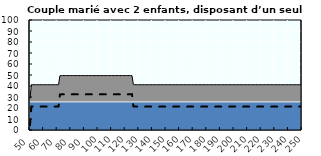
| Category | Coin fiscal marginal (somme des composantes) | Taux d’imposition marginal net |
|---|---|---|
| 50.0 | 28.469 | 4.291 |
| 51.0 | 41.166 | 21.28 |
| 52.0 | 41.166 | 21.28 |
| 53.0 | 41.166 | 21.28 |
| 54.0 | 41.166 | 21.28 |
| 55.0 | 41.166 | 21.28 |
| 56.0 | 41.166 | 21.28 |
| 57.0 | 41.166 | 21.28 |
| 58.0 | 41.166 | 21.28 |
| 59.0 | 41.166 | 21.28 |
| 60.0 | 41.166 | 21.28 |
| 61.0 | 41.166 | 21.28 |
| 62.0 | 41.166 | 21.28 |
| 63.0 | 41.166 | 21.28 |
| 64.0 | 41.166 | 21.28 |
| 65.0 | 41.166 | 21.28 |
| 66.0 | 41.166 | 21.28 |
| 67.0 | 41.166 | 21.28 |
| 68.0 | 41.166 | 21.28 |
| 69.0 | 41.166 | 21.28 |
| 70.0 | 41.166 | 21.28 |
| 71.0 | 41.166 | 21.28 |
| 72.0 | 49.358 | 32.24 |
| 73.0 | 49.47 | 32.391 |
| 74.0 | 49.47 | 32.391 |
| 75.0 | 49.47 | 32.391 |
| 76.0 | 49.47 | 32.391 |
| 77.0 | 49.47 | 32.391 |
| 78.0 | 49.47 | 32.391 |
| 79.0 | 49.47 | 32.391 |
| 80.0 | 49.47 | 32.391 |
| 81.0 | 49.47 | 32.391 |
| 82.0 | 49.47 | 32.391 |
| 83.0 | 49.47 | 32.391 |
| 84.0 | 49.47 | 32.391 |
| 85.0 | 49.47 | 32.391 |
| 86.0 | 49.47 | 32.391 |
| 87.0 | 49.47 | 32.391 |
| 88.0 | 49.47 | 32.391 |
| 89.0 | 49.47 | 32.391 |
| 90.0 | 49.47 | 32.391 |
| 91.0 | 49.47 | 32.391 |
| 92.0 | 49.47 | 32.391 |
| 93.0 | 49.47 | 32.391 |
| 94.0 | 49.47 | 32.391 |
| 95.0 | 49.47 | 32.391 |
| 96.0 | 49.47 | 32.391 |
| 97.0 | 49.47 | 32.391 |
| 98.0 | 49.47 | 32.391 |
| 99.0 | 49.47 | 32.391 |
| 100.0 | 49.47 | 32.391 |
| 101.0 | 49.47 | 32.391 |
| 102.0 | 49.47 | 32.391 |
| 103.0 | 49.47 | 32.391 |
| 104.0 | 49.47 | 32.391 |
| 105.0 | 49.47 | 32.391 |
| 106.0 | 49.47 | 32.391 |
| 107.0 | 49.47 | 32.391 |
| 108.0 | 49.47 | 32.391 |
| 109.0 | 49.47 | 32.391 |
| 110.0 | 49.47 | 32.391 |
| 111.0 | 49.47 | 32.391 |
| 112.0 | 49.47 | 32.391 |
| 113.0 | 49.47 | 32.391 |
| 114.0 | 49.47 | 32.391 |
| 115.0 | 49.47 | 32.391 |
| 116.0 | 49.47 | 32.391 |
| 117.0 | 49.47 | 32.391 |
| 118.0 | 49.47 | 32.391 |
| 119.0 | 49.47 | 32.391 |
| 120.0 | 49.47 | 32.391 |
| 121.0 | 49.47 | 32.391 |
| 122.0 | 49.47 | 32.391 |
| 123.0 | 49.47 | 32.391 |
| 124.0 | 49.47 | 32.391 |
| 125.0 | 49.47 | 32.391 |
| 126.0 | 41.363 | 21.544 |
| 127.0 | 41.166 | 21.28 |
| 128.0 | 41.166 | 21.28 |
| 129.0 | 41.166 | 21.28 |
| 130.0 | 41.166 | 21.28 |
| 131.0 | 41.166 | 21.28 |
| 132.0 | 41.166 | 21.28 |
| 133.0 | 41.166 | 21.28 |
| 134.0 | 41.166 | 21.28 |
| 135.0 | 41.166 | 21.28 |
| 136.0 | 41.166 | 21.28 |
| 137.0 | 41.166 | 21.28 |
| 138.0 | 41.166 | 21.28 |
| 139.0 | 41.166 | 21.28 |
| 140.0 | 41.166 | 21.28 |
| 141.0 | 41.166 | 21.28 |
| 142.0 | 41.166 | 21.28 |
| 143.0 | 41.166 | 21.28 |
| 144.0 | 41.166 | 21.28 |
| 145.0 | 41.166 | 21.28 |
| 146.0 | 41.166 | 21.28 |
| 147.0 | 41.166 | 21.28 |
| 148.0 | 41.166 | 21.28 |
| 149.0 | 41.166 | 21.28 |
| 150.0 | 41.166 | 21.28 |
| 151.0 | 41.166 | 21.28 |
| 152.0 | 41.166 | 21.28 |
| 153.0 | 41.166 | 21.28 |
| 154.0 | 41.166 | 21.28 |
| 155.0 | 41.166 | 21.28 |
| 156.0 | 41.166 | 21.28 |
| 157.0 | 41.166 | 21.28 |
| 158.0 | 41.166 | 21.28 |
| 159.0 | 41.166 | 21.28 |
| 160.0 | 41.166 | 21.28 |
| 161.0 | 41.166 | 21.28 |
| 162.0 | 41.166 | 21.28 |
| 163.0 | 41.166 | 21.28 |
| 164.0 | 41.166 | 21.28 |
| 165.0 | 41.166 | 21.28 |
| 166.0 | 41.166 | 21.28 |
| 167.0 | 41.166 | 21.28 |
| 168.0 | 41.166 | 21.28 |
| 169.0 | 41.166 | 21.28 |
| 170.0 | 41.166 | 21.28 |
| 171.0 | 41.166 | 21.28 |
| 172.0 | 41.166 | 21.28 |
| 173.0 | 41.166 | 21.28 |
| 174.0 | 41.166 | 21.28 |
| 175.0 | 41.166 | 21.28 |
| 176.0 | 41.166 | 21.28 |
| 177.0 | 41.166 | 21.28 |
| 178.0 | 41.166 | 21.28 |
| 179.0 | 41.166 | 21.28 |
| 180.0 | 41.166 | 21.28 |
| 181.0 | 41.166 | 21.28 |
| 182.0 | 41.166 | 21.28 |
| 183.0 | 41.166 | 21.28 |
| 184.0 | 41.166 | 21.28 |
| 185.0 | 41.166 | 21.28 |
| 186.0 | 41.166 | 21.28 |
| 187.0 | 41.166 | 21.28 |
| 188.0 | 41.166 | 21.28 |
| 189.0 | 41.166 | 21.28 |
| 190.0 | 41.166 | 21.28 |
| 191.0 | 41.166 | 21.28 |
| 192.0 | 41.166 | 21.28 |
| 193.0 | 41.166 | 21.28 |
| 194.0 | 41.166 | 21.28 |
| 195.0 | 41.166 | 21.28 |
| 196.0 | 41.166 | 21.28 |
| 197.0 | 41.166 | 21.28 |
| 198.0 | 41.166 | 21.28 |
| 199.0 | 41.166 | 21.28 |
| 200.0 | 41.166 | 21.28 |
| 201.0 | 41.166 | 21.28 |
| 202.0 | 41.166 | 21.28 |
| 203.0 | 41.166 | 21.28 |
| 204.0 | 41.166 | 21.28 |
| 205.0 | 41.166 | 21.28 |
| 206.0 | 41.166 | 21.28 |
| 207.0 | 41.166 | 21.28 |
| 208.0 | 41.166 | 21.28 |
| 209.0 | 41.166 | 21.28 |
| 210.0 | 41.166 | 21.28 |
| 211.0 | 41.166 | 21.28 |
| 212.0 | 41.166 | 21.28 |
| 213.0 | 41.166 | 21.28 |
| 214.0 | 41.166 | 21.28 |
| 215.0 | 41.166 | 21.28 |
| 216.0 | 41.166 | 21.28 |
| 217.0 | 41.166 | 21.28 |
| 218.0 | 41.166 | 21.28 |
| 219.0 | 41.166 | 21.28 |
| 220.0 | 41.166 | 21.28 |
| 221.0 | 41.166 | 21.28 |
| 222.0 | 41.166 | 21.28 |
| 223.0 | 41.166 | 21.28 |
| 224.0 | 41.166 | 21.28 |
| 225.0 | 41.166 | 21.28 |
| 226.0 | 41.166 | 21.28 |
| 227.0 | 41.166 | 21.28 |
| 228.0 | 41.166 | 21.28 |
| 229.0 | 41.166 | 21.28 |
| 230.0 | 41.166 | 21.28 |
| 231.0 | 41.166 | 21.28 |
| 232.0 | 41.166 | 21.28 |
| 233.0 | 41.166 | 21.28 |
| 234.0 | 41.166 | 21.28 |
| 235.0 | 41.166 | 21.28 |
| 236.0 | 41.166 | 21.28 |
| 237.0 | 41.166 | 21.28 |
| 238.0 | 41.166 | 21.28 |
| 239.0 | 41.166 | 21.28 |
| 240.0 | 41.166 | 21.28 |
| 241.0 | 41.166 | 21.28 |
| 242.0 | 41.166 | 21.28 |
| 243.0 | 41.166 | 21.28 |
| 244.0 | 41.166 | 21.28 |
| 245.0 | 41.166 | 21.28 |
| 246.0 | 41.166 | 21.28 |
| 247.0 | 41.166 | 21.28 |
| 248.0 | 41.166 | 21.28 |
| 249.0 | 41.166 | 21.28 |
| 250.0 | 41.166 | 21.28 |